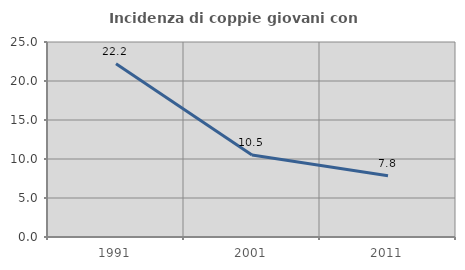
| Category | Incidenza di coppie giovani con figli |
|---|---|
| 1991.0 | 22.222 |
| 2001.0 | 10.526 |
| 2011.0 | 7.843 |